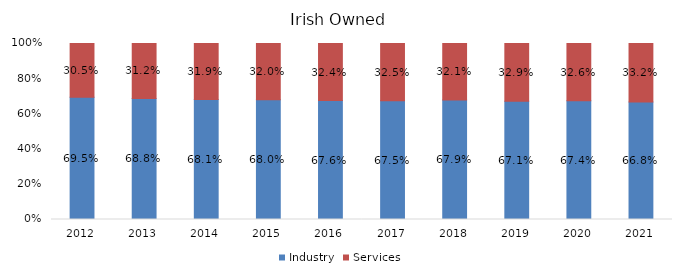
| Category | Industry | Services |
|---|---|---|
| 2012.0 | 0.695 | 0.305 |
| 2013.0 | 0.688 | 0.312 |
| 2014.0 | 0.681 | 0.319 |
| 2015.0 | 0.68 | 0.32 |
| 2016.0 | 0.676 | 0.324 |
| 2017.0 | 0.675 | 0.325 |
| 2018.0 | 0.679 | 0.321 |
| 2019.0 | 0.671 | 0.329 |
| 2020.0 | 0.674 | 0.326 |
| 2021.0 | 0.668 | 0.332 |